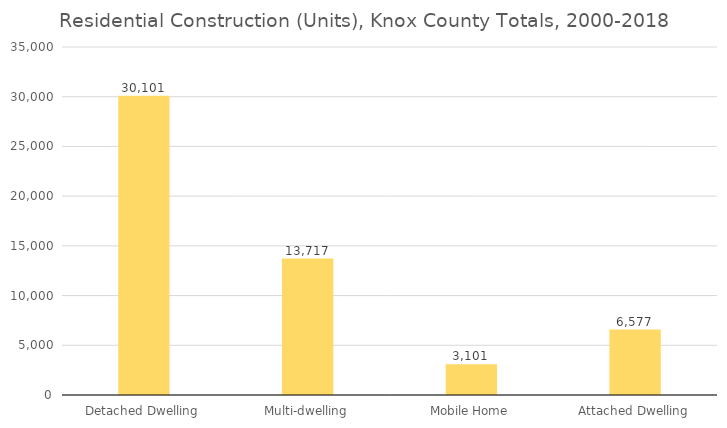
| Category | Residential |
|---|---|
| Detached Dwelling | 30101 |
| Multi-dwelling | 13717 |
| Mobile Home | 3101 |
| Attached Dwelling | 6577 |